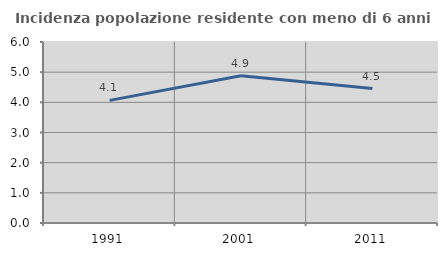
| Category | Incidenza popolazione residente con meno di 6 anni |
|---|---|
| 1991.0 | 4.065 |
| 2001.0 | 4.883 |
| 2011.0 | 4.458 |